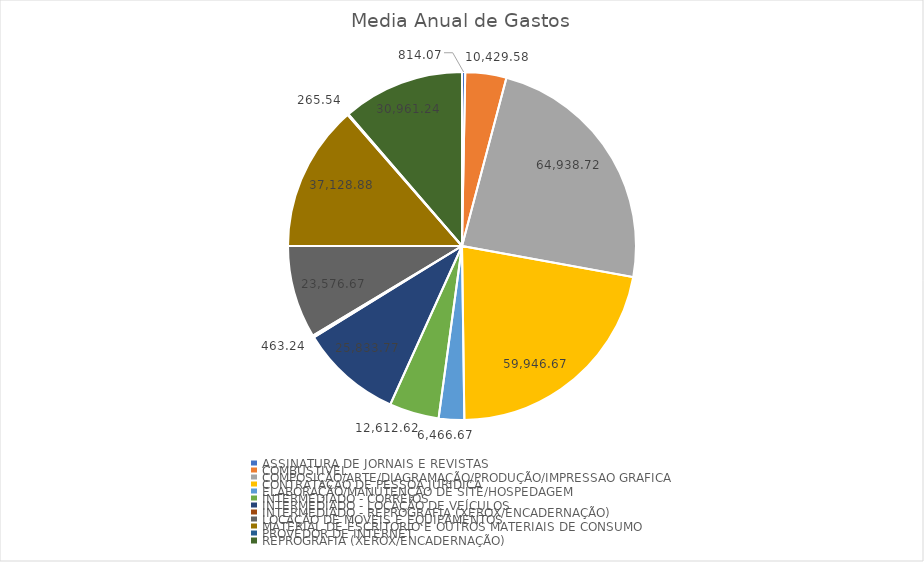
| Category | Series 0 |
|---|---|
| ASSINATURA DE JORNAIS E REVISTAS | 814.067 |
| COMBUSTIVEL | 10429.583 |
| COMPOSIÇÃO/ARTE/DIAGRAMAÇÃO/PRODUÇÃO/IMPRESSAO GRAFICA | 64938.723 |
| CONTRATAÇAO DE PESSOA JURIDICA | 59946.667 |
| ELABORAÇÃO/MANUTENÇAO DE SITE/HOSPEDAGEM | 6466.667 |
| INTERMEDIADO - CORREIOS | 12612.617 |
| INTERMEDIADO - LOCAÇÃO DE VEÍCULOS | 25833.77 |
| INTERMEDIADO - REPROGRAFIA (XEROX/ENCADERNAÇÃO) | 463.24 |
| LOCAÇÃO DE MOVEIS E EQUIPAMENTOS | 23576.667 |
| MATERIAL DE ESCRITORIO E OUTROS MATERIAIS DE CONSUMO | 37128.883 |
| PROVEDOR DE INTERNET | 265.537 |
| REPROGRAFIA (XEROX/ENCADERNAÇÃO) | 30961.24 |